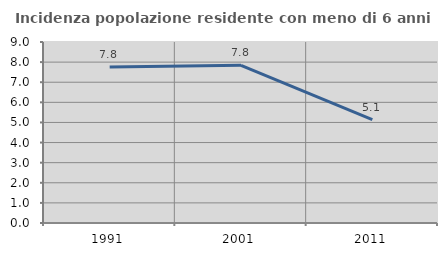
| Category | Incidenza popolazione residente con meno di 6 anni |
|---|---|
| 1991.0 | 7.759 |
| 2001.0 | 7.839 |
| 2011.0 | 5.137 |